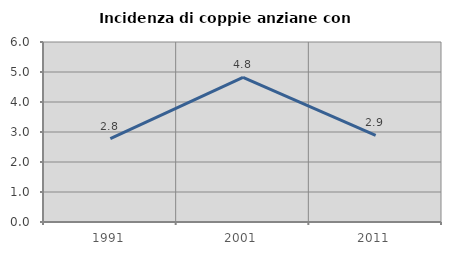
| Category | Incidenza di coppie anziane con figli |
|---|---|
| 1991.0 | 2.778 |
| 2001.0 | 4.819 |
| 2011.0 | 2.89 |